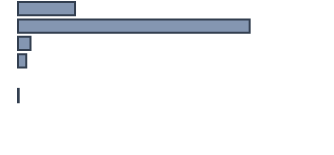
| Category | Series 0 |
|---|---|
| 0 | 18.395 |
| 1 | 74.728 |
| 2 | 4.022 |
| 3 | 2.626 |
| 4 | 0 |
| 5 | 0.228 |
| 6 | 0 |
| 7 | 0 |